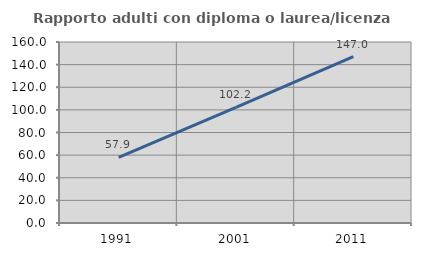
| Category | Rapporto adulti con diploma o laurea/licenza media  |
|---|---|
| 1991.0 | 57.939 |
| 2001.0 | 102.206 |
| 2011.0 | 147.045 |